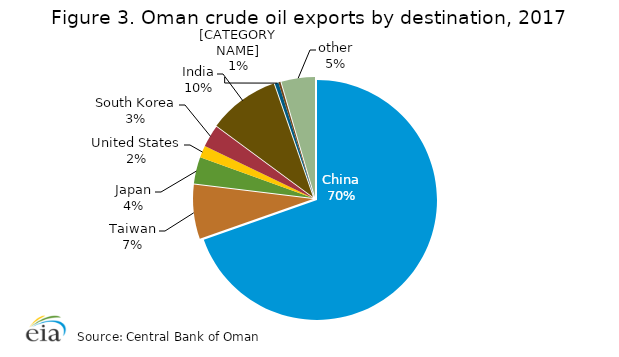
| Category | Series 0 |
|---|---|
| China | 204.8 |
| Taiwan | 21.5 |
| Japan | 10.6 |
| United States | 4.7 |
| South Korea | 8.8 |
| India | 28.2 |
| Signapore | 1.5 |
| Thailand | 0.8 |
| other | 13.3 |